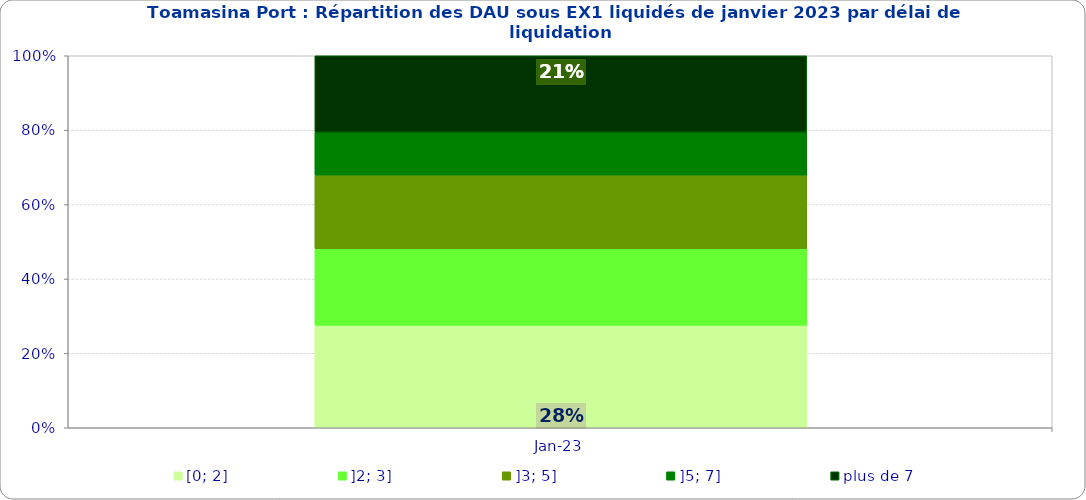
| Category | [0; 2] | ]2; 3] | ]3; 5] | ]5; 7] | plus de 7 |
|---|---|---|---|---|---|
| 2023-01-01 | 0.276 | 0.206 | 0.198 | 0.115 | 0.206 |